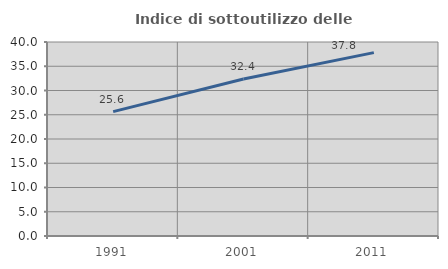
| Category | Indice di sottoutilizzo delle abitazioni  |
|---|---|
| 1991.0 | 25.638 |
| 2001.0 | 32.386 |
| 2011.0 | 37.812 |